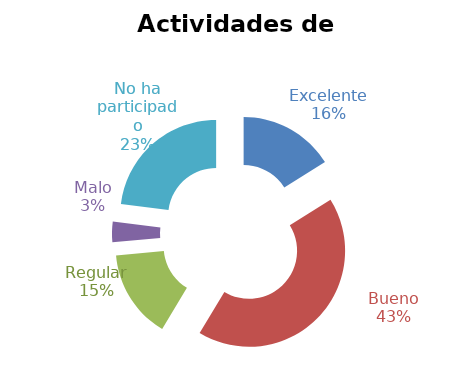
| Category | Series 0 |
|---|---|
| Excelente | 0.161 |
| Bueno | 0.425 |
| Regular | 0.149 |
| Malo | 0.034 |
| No ha participado | 0.23 |